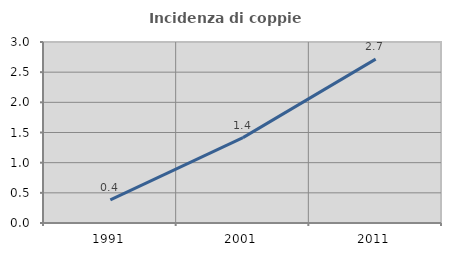
| Category | Incidenza di coppie miste |
|---|---|
| 1991.0 | 0.383 |
| 2001.0 | 1.416 |
| 2011.0 | 2.716 |